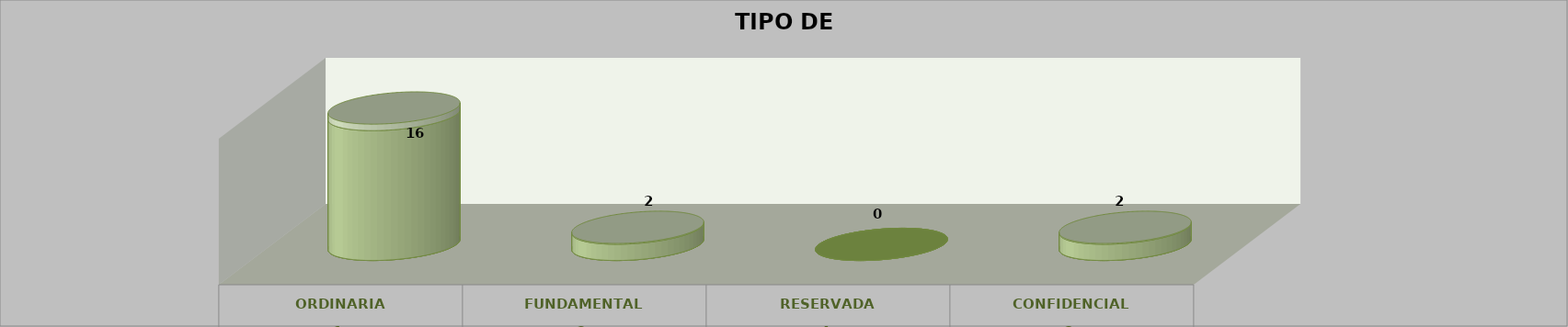
| Category | Series 0 | Series 2 | Series 1 | Series 3 | Series 4 |
|---|---|---|---|---|---|
| 0 |  |  |  | 16 | 0.8 |
| 1 |  |  |  | 2 | 0.1 |
| 2 |  |  |  | 0 | 0 |
| 3 |  |  |  | 2 | 0.1 |